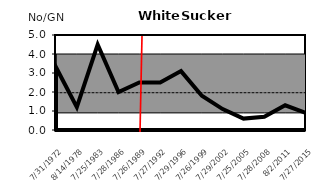
| Category | 3rd | 1st | No/Net | AVG |
|---|---|---|---|---|
| 7/31/72 | 4 | 0.9 | 3.3 | 1.962 |
| 8/14/78 | 4 | 0.9 | 1.2 | 1.962 |
| 7/25/83 | 4 | 0.9 | 4.5 | 1.962 |
| 7/28/86 | 4 | 0.9 | 2 | 1.962 |
| 7/26/89 | 4 | 0.9 | 2.5 | 1.962 |
| 7/27/92 | 4 | 0.9 | 2.5 | 1.962 |
| 7/29/96 | 4 | 0.9 | 3.1 | 1.962 |
| 7/26/99 | 4 | 0.9 | 1.8 | 1.962 |
| 7/29/02 | 4 | 0.9 | 1.1 | 1.962 |
| 7/25/05 | 4 | 0.9 | 0.6 | 1.962 |
| 7/28/08 | 4 | 0.9 | 0.7 | 1.962 |
| 8/2/11 | 4 | 0.9 | 1.3 | 1.962 |
| 7/27/15 | 4 | 0.9 | 0.9 | 1.962 |